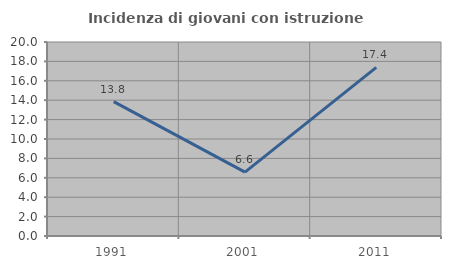
| Category | Incidenza di giovani con istruzione universitaria |
|---|---|
| 1991.0 | 13.846 |
| 2001.0 | 6.579 |
| 2011.0 | 17.391 |